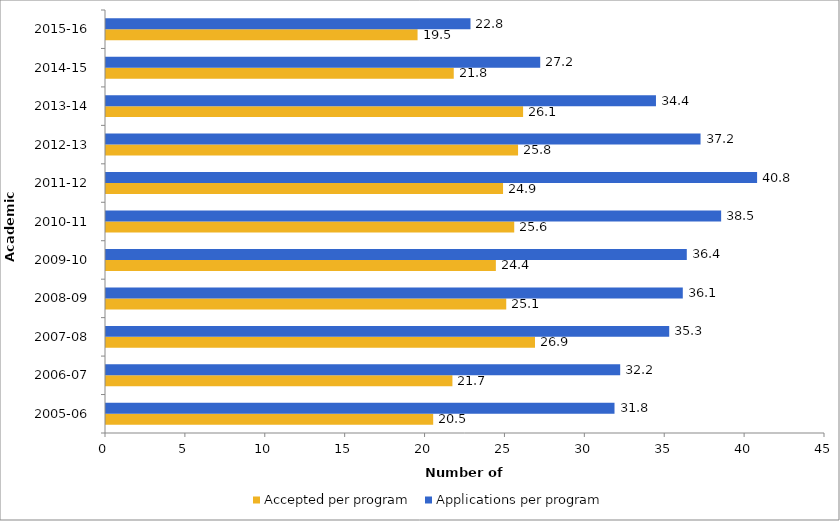
| Category | Accepted per program | Applications per program |
|---|---|---|
| 2005-06 | 20.478 | 31.826 |
| 2006-07 | 21.682 | 32.182 |
| 2007-08 | 26.85 | 35.25 |
| 2008-09 | 25.05 | 36.1 |
| 2009-10 | 24.4 | 36.35 |
| 2010-11 | 25.55 | 38.5 |
| 2011-12 | 24.85 | 40.75 |
| 2012-13 | 25.789 | 37.211 |
| 2013-14 | 26.105 | 34.421 |
| 2014-15 | 21.765 | 27.176 |
| 2015-16 | 19.5 | 22.812 |